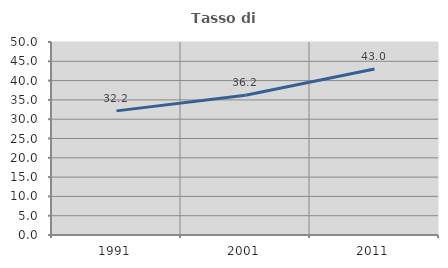
| Category | Tasso di occupazione   |
|---|---|
| 1991.0 | 32.155 |
| 2001.0 | 36.195 |
| 2011.0 | 43.002 |